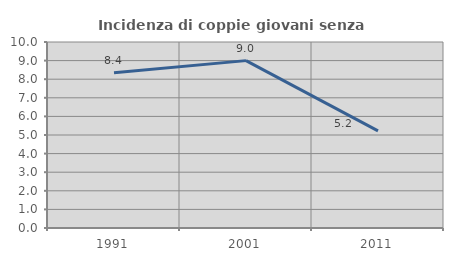
| Category | Incidenza di coppie giovani senza figli |
|---|---|
| 1991.0 | 8.351 |
| 2001.0 | 8.999 |
| 2011.0 | 5.218 |